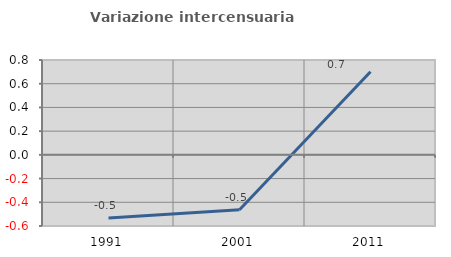
| Category | Variazione intercensuaria annua |
|---|---|
| 1991.0 | -0.532 |
| 2001.0 | -0.463 |
| 2011.0 | 0.7 |